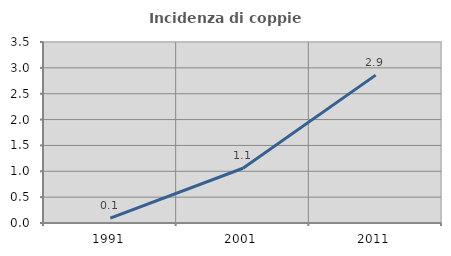
| Category | Incidenza di coppie miste |
|---|---|
| 1991.0 | 0.096 |
| 2001.0 | 1.058 |
| 2011.0 | 2.86 |